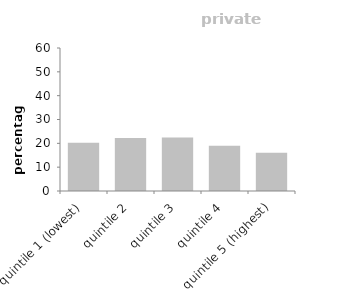
| Category | private renters percentages |
|---|---|
| quintile 1 (lowest) | 20.251 |
| quintile 2 | 22.288 |
| quintile 3 | 22.448 |
| quintile 4 | 18.937 |
| quintile 5 (highest) | 16.076 |